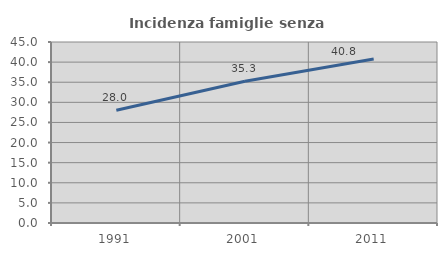
| Category | Incidenza famiglie senza nuclei |
|---|---|
| 1991.0 | 28.032 |
| 2001.0 | 35.251 |
| 2011.0 | 40.787 |